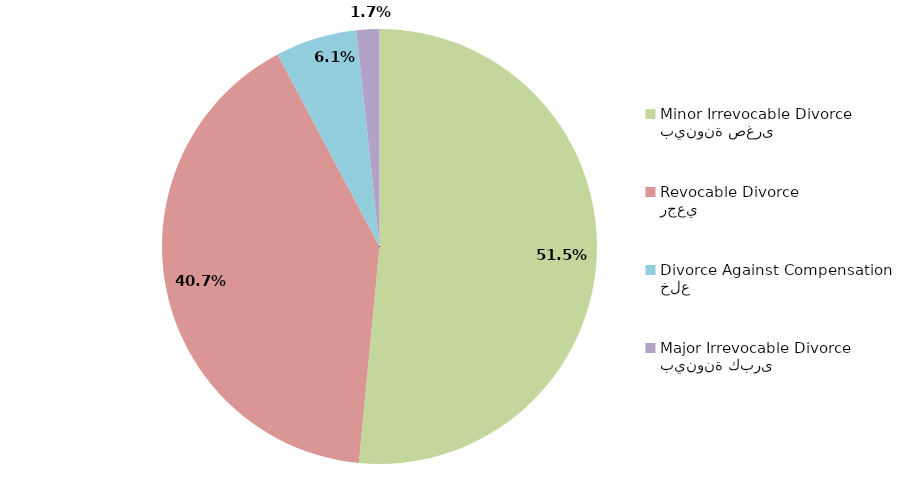
| Category | Series 1 |
|---|---|
| بينونة صغرى
Minor Irrevocable Divorce  | 51.515 |
| رجعي
Revocable Divorce  | 40.72 |
| خلع
Divorce Against Compensation | 6.061 |
| بينونة كبرى
Major Irrevocable Divorce  | 1.705 |